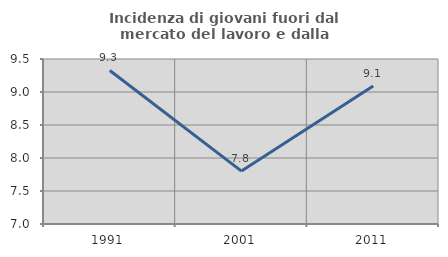
| Category | Incidenza di giovani fuori dal mercato del lavoro e dalla formazione  |
|---|---|
| 1991.0 | 9.326 |
| 2001.0 | 7.801 |
| 2011.0 | 9.091 |